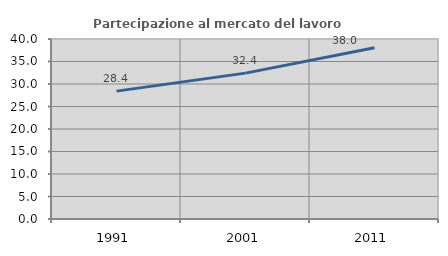
| Category | Partecipazione al mercato del lavoro  femminile |
|---|---|
| 1991.0 | 28.417 |
| 2001.0 | 32.419 |
| 2011.0 | 38.04 |